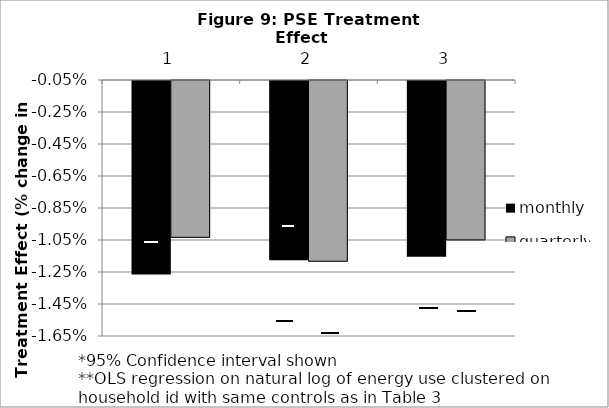
| Category | monthly | quarterly |
|---|---|---|
| 0 | -0.013 | -0.01 |
| 1 | -0.012 | -0.012 |
| 2 | -0.011 | -0.01 |